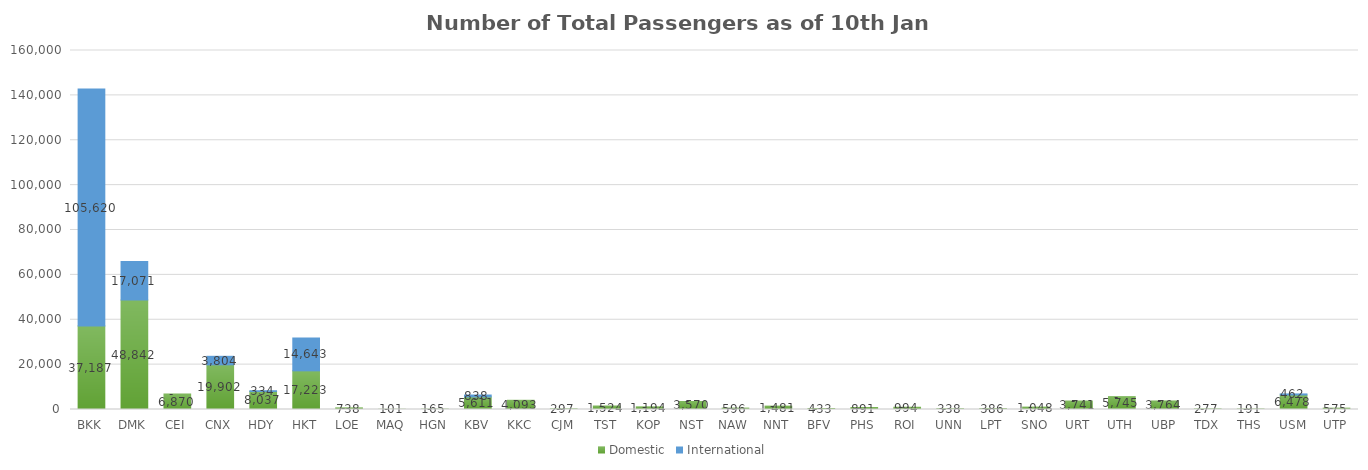
| Category | Domestic | International |
|---|---|---|
| BKK | 37187 | 105620 |
| DMK | 48842 | 17071 |
| CEI | 6870 | 0 |
| CNX | 19902 | 3804 |
| HDY | 8037 | 334 |
| HKT | 17223 | 14643 |
| LOE | 738 | 0 |
| MAQ | 101 | 0 |
| HGN | 165 | 0 |
| KBV | 5611 | 838 |
| KKC | 4093 | 0 |
| CJM | 297 | 0 |
| TST | 1524 | 0 |
| KOP | 1194 | 0 |
| NST | 3570 | 0 |
| NAW | 596 | 0 |
| NNT | 1481 | 0 |
| BFV | 433 | 0 |
| PHS | 891 | 0 |
| ROI | 994 | 0 |
| UNN | 338 | 0 |
| LPT | 386 | 0 |
| SNO | 1048 | 0 |
| URT | 3741 | 0 |
| UTH | 5745 | 0 |
| UBP | 3764 | 0 |
| TDX | 277 | 0 |
| THS | 191 | 0 |
| USM | 6478 | 462 |
| UTP | 575 | 0 |